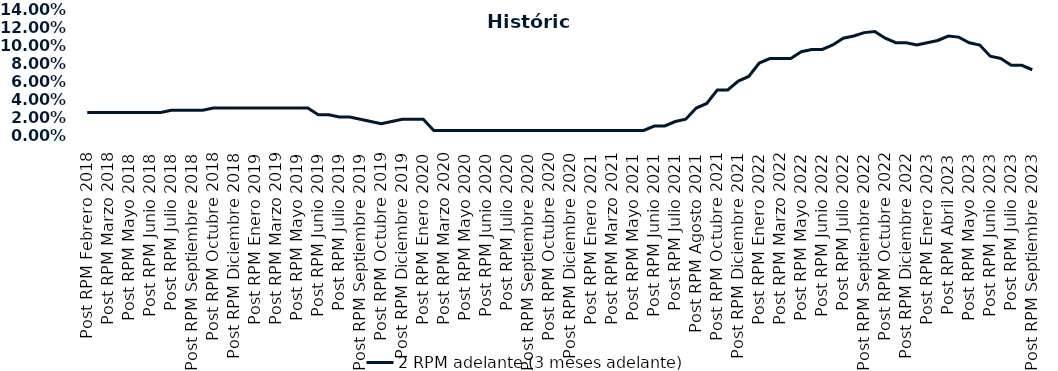
| Category | 2 RPM adelante (3 meses adelante) |
|---|---|
| Post RPM Febrero 2018 | 0.025 |
| Pre RPM Marzo 2018 | 0.025 |
| Post RPM Marzo 2018 | 0.025 |
| Pre RPM Mayo 2018 | 0.025 |
| Post RPM Mayo 2018 | 0.025 |
| Pre RPM Junio 2018 | 0.025 |
| Post RPM Junio 2018 | 0.025 |
| Pre RPM Julio 2018 | 0.025 |
| Post RPM Julio 2018 | 0.028 |
| Pre RPM Septiembre 2018 | 0.028 |
| Post RPM Septiembre 2018 | 0.028 |
| Pre RPM Octubre 2018 | 0.028 |
| Post RPM Octubre 2018 | 0.03 |
| Pre RPM Diciembre 2018 | 0.03 |
| Post RPM Diciembre 2018 | 0.03 |
| Pre RPM Enero 2019 | 0.03 |
| Post RPM Enero 2019 | 0.03 |
| Pre RPM Marzo 2019 | 0.03 |
| Post RPM Marzo 2019 | 0.03 |
| Pre RPM Mayo 2019 | 0.03 |
| Post RPM Mayo 2019 | 0.03 |
| Pre RPM Junio 2019 | 0.03 |
| Post RPM Junio 2019 | 0.022 |
| Pre RPM Julio 2019 | 0.022 |
| Post RPM Julio 2019 | 0.02 |
| Pre RPM Septiembre 2019 | 0.02 |
| Post RPM Septiembre 2019 | 0.018 |
| Pre RPM Octubre 2019 | 0.015 |
| Post RPM Octubre 2019 | 0.012 |
| Pre RPM Diciembre 2019 | 0.015 |
| Post RPM Diciembre 2019 | 0.018 |
| Pre RPM Enero 2020 | 0.018 |
| Post RPM Enero 2020 | 0.018 |
| Pre RPM Marzo 2020 | 0.005 |
| Post RPM Marzo 2020 | 0.005 |
| Pre RPM Mayo 2020 | 0.005 |
| Post RPM Mayo 2020 | 0.005 |
| Pre RPM Junio 2020 | 0.005 |
| Post RPM Junio 2020 | 0.005 |
| Pre RPM Julio 2020 | 0.005 |
| Post RPM Julio 2020 | 0.005 |
| Pre RPM Septiembre 2020 | 0.005 |
| Post RPM Septiembre 2020 | 0.005 |
| Pre RPM Octubre 2020 | 0.005 |
| Post RPM Octubre 2020 | 0.005 |
| Pre RPM Diciembre 2020 | 0.005 |
| Post RPM Diciembre 2020 | 0.005 |
| Pre RPM Enero 2021 | 0.005 |
| Post RPM Enero 2021 | 0.005 |
| Pre RPM Marzo 2021 | 0.005 |
| Post RPM Marzo 2021 | 0.005 |
| Pre RPM Mayo 2021 | 0.005 |
| Post RPM Mayo 2021 | 0.005 |
| Pre RPM Junio 2021 | 0.005 |
| Post RPM Junio 2021 | 0.01 |
| Pre RPM Julio 2021 | 0.01 |
| Post RPM Julio 2021 | 0.015 |
| Pre RPM Agosto 2021 | 0.018 |
| Post RPM Agosto 2021 | 0.03 |
| Pre RPM Octubre 2021 | 0.035 |
| Post RPM Octubre 2021 | 0.05 |
| Pre RPM Diciembre 2021 | 0.05 |
| Post RPM Diciembre 2021 | 0.06 |
| Pre RPM Enero 2022 | 0.065 |
| Post RPM Enero 2022 | 0.08 |
| Pre RPM Marzo 2022 | 0.085 |
| Post RPM Marzo 2022 | 0.085 |
| Pre RPM Mayo 2022 | 0.085 |
| Post RPM Mayo 2022 | 0.092 |
| Pre RPM Junio 2022 | 0.095 |
| Post RPM Junio 2022 | 0.095 |
| Pre RPM Julio 2022 | 0.1 |
| Post RPM Julio 2022 | 0.108 |
| Pre RPM Septiembre 2022 | 0.11 |
| Post RPM Septiembre 2022 | 0.114 |
| Pre RPM Octubre 2022 | 0.115 |
| Post RPM Octubre 2022 | 0.108 |
| Pre RPM Diciembre 2022 | 0.102 |
| Post RPM Diciembre 2022 | 0.102 |
| Pre RPM Enero 2023 | 0.1 |
| Post RPM Enero 2023 | 0.102 |
| Pre RPM Abril 2023 | 0.105 |
| Post RPM Abril 2023 | 0.11 |
| Pre RPM Mayo 2023 | 0.109 |
| Post RPM Mayo 2023 | 0.102 |
| Pre RPM Junio 2023 | 0.1 |
| Post RPM Junio 2023 | 0.088 |
| Pre RPM Julio 2023 | 0.085 |
| Post RPM Julio 2023 | 0.078 |
| Pre RPM Septiembre 2023 | 0.078 |
| Post RPM Septiembre 2023 | 0.072 |